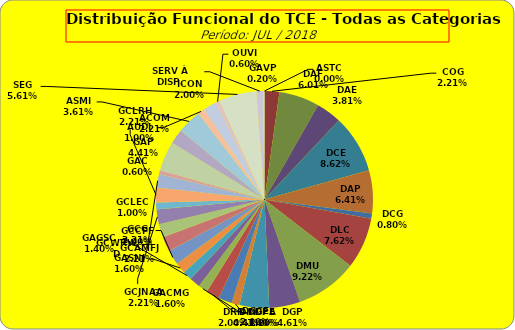
| Category | ASTC |
|---|---|
| ASTC | 0 |
| COG | 11 |
| DAF | 30 |
| DAE | 19 |
| DCE | 43 |
| DAP | 32 |
| DCG | 4 |
| DLC | 38 |
| DMU | 46 |
| DGP | 23 |
| DIN | 22 |
| DPE | 6 |
| DRR | 10 |
| DGCE | 10 |
| DGPA | 7 |
| GACMG | 8 |
| GAGSC | 7 |
| GASNI | 8 |
| GCG | 11 |
| GCAMFJ | 11 |
| GCCFF | 10 |
| GCJNAA | 11 |
| GCLEC | 5 |
| GCLRH | 11 |
| GCWRWD | 10 |
| GAC | 3 |
| GAP | 22 |
| ACOM | 11 |
| ASMI | 18 |
| AUDI | 5 |
| ICON | 10 |
| OUVI | 3 |
| SEG | 28 |
| SERV À DISP. | 5 |
| GAVP | 1 |